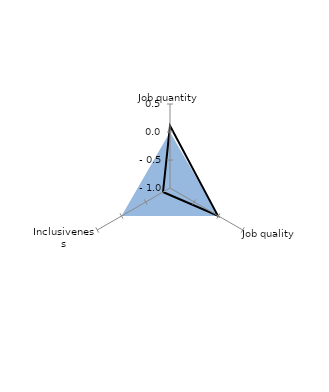
| Category | OECD average | Priority: inclusiveness |
|---|---|---|
| Job quantity  | 0 | 0.11 |
| Job quality  | 0 | -0.014 |
| Inclusiveness | 0 | -0.856 |